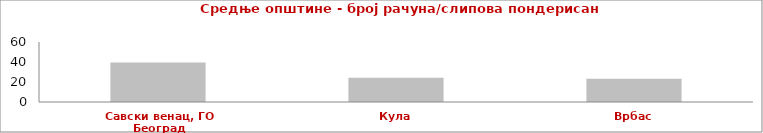
| Category | Series 0 |
|---|---|
| Савски венац, ГО Београд | 39.505 |
| Кула | 24.135 |
| Врбас | 23.153 |